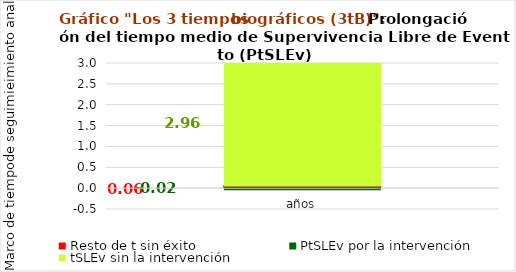
| Category | Resto de t sin éxito | PtSLEv por la intervención | tSLEv sin la intervención |
|---|---|---|---|
| años | 0.062 | -0.024 | 2.963 |